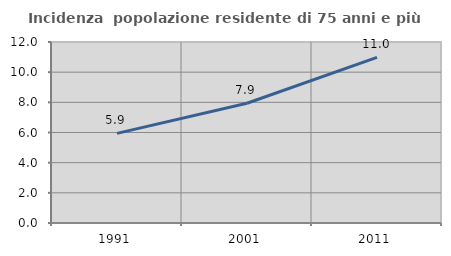
| Category | Incidenza  popolazione residente di 75 anni e più |
|---|---|
| 1991.0 | 5.944 |
| 2001.0 | 7.938 |
| 2011.0 | 10.979 |